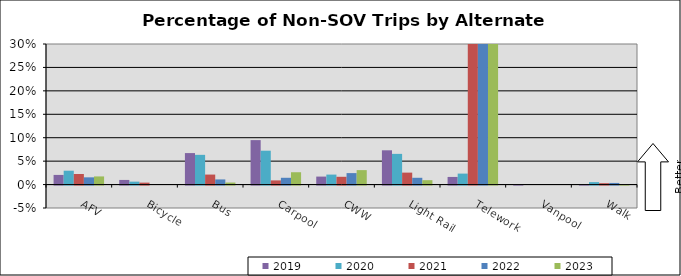
| Category | 2019 | 2020 | 2021 | 2022 | 2023 |
|---|---|---|---|---|---|
| AFV | 0.021 | 0.03 | 0.023 | 0.015 | 0.017 |
| Bicycle | 0.01 | 0.006 | 0.004 | 0 | 0 |
| Bus | 0.067 | 0.063 | 0.021 | 0.011 | 0.004 |
| Carpool | 0.095 | 0.072 | 0.009 | 0.014 | 0.026 |
| CWW | 0.017 | 0.021 | 0.017 | 0.024 | 0.031 |
| Light Rail | 0.073 | 0.066 | 0.026 | 0.014 | 0.009 |
| Telework | 0.016 | 0.023 | 0.542 | 0.468 | 0.558 |
| Vanpool | 0 | 0 | 0 | 0 | 0 |
| Walk | 0 | 0.005 | 0.003 | 0.003 | 0 |